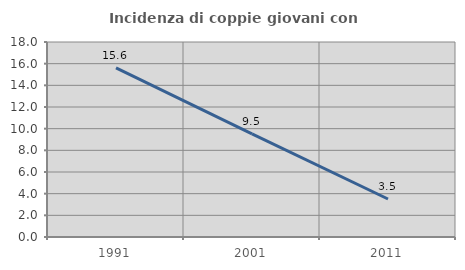
| Category | Incidenza di coppie giovani con figli |
|---|---|
| 1991.0 | 15.603 |
| 2001.0 | 9.524 |
| 2011.0 | 3.509 |